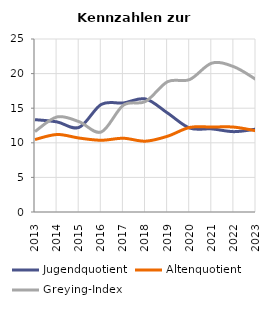
| Category | Jugendquotient | Altenquotient | Greying-Index |
|---|---|---|---|
| 2013.0 | 13.347 | 10.472 | 11.628 |
| 2014.0 | 13.017 | 11.201 | 13.74 |
| 2015.0 | 12.237 | 10.685 | 13.043 |
| 2016.0 | 15.55 | 10.366 | 11.565 |
| 2017.0 | 15.756 | 10.656 | 15.436 |
| 2018.0 | 16.338 | 10.233 | 15.972 |
| 2019.0 | 14.299 | 10.95 | 18.831 |
| 2020.0 | 12.13 | 12.22 | 19.14 |
| 2021.0 | 12.011 | 12.278 | 21.512 |
| 2022.0 | 11.61 | 12.27 | 20.99 |
| 2023.0 | 11.977 | 11.731 | 19.149 |